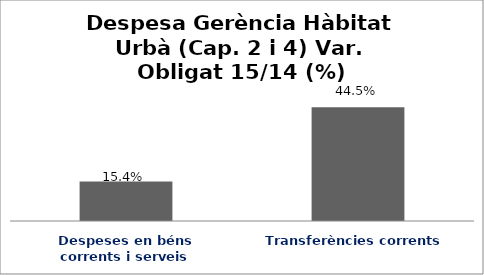
| Category | Series 0 |
|---|---|
| Despeses en béns corrents i serveis | 0.154 |
| Transferències corrents | 0.445 |